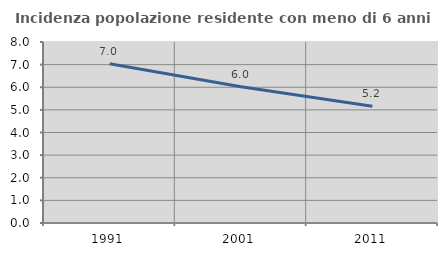
| Category | Incidenza popolazione residente con meno di 6 anni |
|---|---|
| 1991.0 | 7.036 |
| 2001.0 | 6.023 |
| 2011.0 | 5.164 |